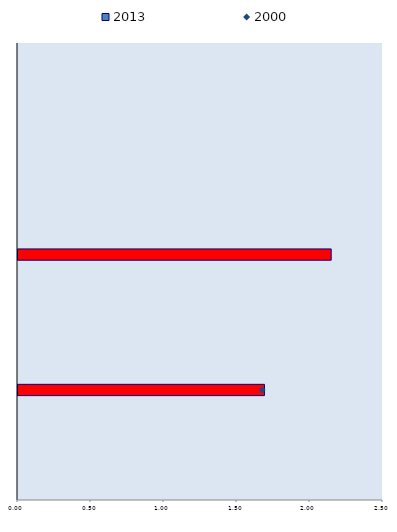
| Category | 2013 |
|---|---|
| Papua New Guinea | 0 |
| Pakistan | 0 |
| Philippines | 0 |
| Lao PDR | 0 |
| Cambodia | 0 |
| Fiji | 0 |
| India | 0 |
| Mongolia | 0 |
| Sri Lanka | 0 |
| Indonesia | 0 |
| Nepal | 0 |
| Bangladesh | 0 |
| Asia | 2.152 |
| Azerbaijan | 0 |
| Malaysia | 0 |
| New Zealand | 0 |
| Myanmar | 0 |
| Australia | 0 |
| Vietnam | 0 |
| Armenia | 0 |
| OECD Average | 1.695 |
| China | 0 |
| Japan | 0 |
| Thailand | 0 |
| Singapore | 0 |
| Korea, Rep. | 0 |
| Hong Kong SAR, China | 0 |